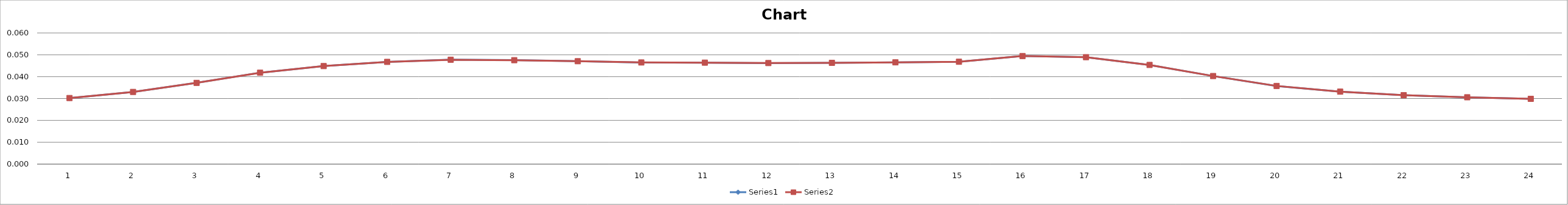
| Category | Series 0 | Series 1 |
|---|---|---|
| 0 | 0.03 | 0.03 |
| 1 | 0.033 | 0.033 |
| 2 | 0.037 | 0.037 |
| 3 | 0.042 | 0.042 |
| 4 | 0.045 | 0.045 |
| 5 | 0.047 | 0.047 |
| 6 | 0.048 | 0.048 |
| 7 | 0.048 | 0.048 |
| 8 | 0.047 | 0.047 |
| 9 | 0.046 | 0.047 |
| 10 | 0.046 | 0.046 |
| 11 | 0.046 | 0.046 |
| 12 | 0.046 | 0.046 |
| 13 | 0.047 | 0.047 |
| 14 | 0.047 | 0.047 |
| 15 | 0.049 | 0.049 |
| 16 | 0.049 | 0.049 |
| 17 | 0.045 | 0.045 |
| 18 | 0.04 | 0.04 |
| 19 | 0.036 | 0.036 |
| 20 | 0.033 | 0.033 |
| 21 | 0.032 | 0.032 |
| 22 | 0.031 | 0.031 |
| 23 | 0.03 | 0.03 |